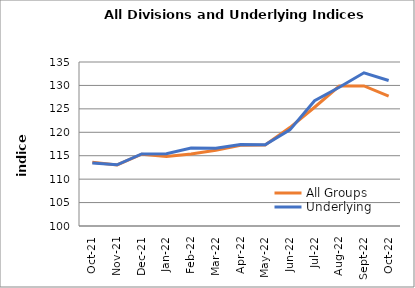
| Category | All Groups | Underlying |
|---|---|---|
| 2021-10-01 | 113.609 | 113.469 |
| 2021-11-01 | 113.04 | 113.069 |
| 2021-12-01 | 115.331 | 115.373 |
| 2022-01-01 | 114.841 | 115.444 |
| 2022-02-01 | 115.348 | 116.622 |
| 2022-03-01 | 116.161 | 116.584 |
| 2022-04-01 | 117.224 | 117.408 |
| 2022-05-01 | 117.307 | 117.326 |
| 2022-06-01 | 121.013 | 120.516 |
| 2022-07-01 | 125.348 | 126.726 |
| 2022-08-01 | 129.854 | 129.6 |
| 2022-09-01 | 129.894 | 132.699 |
| 2022-10-01 | 127.725 | 131.059 |